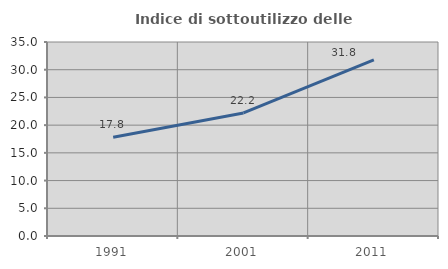
| Category | Indice di sottoutilizzo delle abitazioni  |
|---|---|
| 1991.0 | 17.81 |
| 2001.0 | 22.207 |
| 2011.0 | 31.766 |